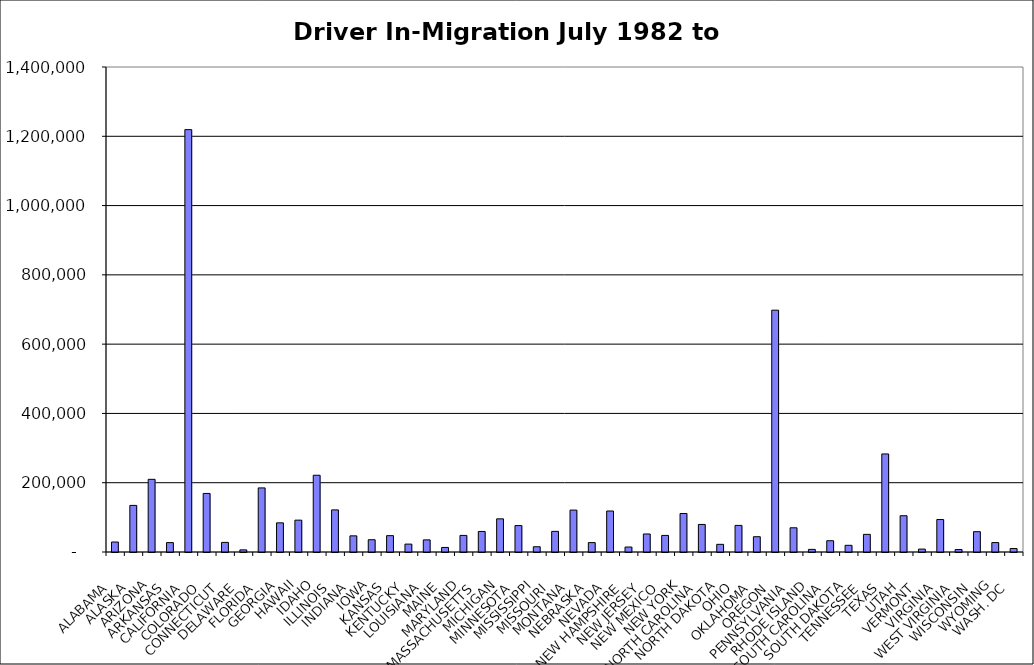
| Category | Series 0 |
|---|---|
|  ALABAMA  | 28818.5 |
|  ALASKA  | 134505.5 |
|  ARIZONA  | 209773 |
|  ARKANSAS  | 27127.5 |
|  CALIFORNIA  | 1219220.5 |
|  COLORADO  | 169067 |
|  CONNECTICUT  | 27771 |
|  DELAWARE  | 6169.5 |
|  FLORIDA  | 185001 |
|  GEORGIA  | 84205 |
|  HAWAII  | 91956.5 |
|  IDAHO  | 221551.5 |
|  ILLINOIS  | 121548.5 |
|  INDIANA  | 46621 |
|  IOWA  | 35422.5 |
|  KANSAS  | 47178.5 |
|  KENTUCKY  | 22809 |
|  LOUISIANA  | 34989.5 |
|  MAINE  | 13169.5 |
|  MARYLAND  | 47856 |
|  MASSACHUSETTS  | 59275 |
|  MICHIGAN  | 95718 |
|  MINNESOTA  | 76249.5 |
|  MISSISSIPPI  | 15194 |
|  MISSOURI  | 59562 |
|  MONTANA  | 120986 |
|  NEBRASKA  | 27114.5 |
|  NEVADA  | 118331 |
|  NEW HAMPSHIRE  | 14348.5 |
|  NEW JERSEY  | 52033 |
|  NEW MEXICO  | 47895 |
|  NEW YORK  | 111098 |
|  NORTH CAROLINA  | 79548.5 |
|  NORTH DAKOTA  | 22144.5 |
|  OHIO  | 76802.5 |
|  OKLAHOMA  | 44139 |
|  OREGON  | 698045 |
|  PENNSYLVANIA  | 69889.5 |
|  RHODE ISLAND  | 7553 |
|  SOUTH CAROLINA  | 32556.5 |
|  SOUTH DAKOTA  | 19294.5 |
|  TENNESSEE  | 50884.5 |
|  TEXAS  | 283063 |
|  UTAH  | 104704.5 |
|  VERMONT  | 8431 |
|  VIRGINIA  | 93691 |
|  WEST VIRGINIA  | 7111.5 |
|  WISCONSIN  | 58663.5 |
|  WYOMING  | 27209 |
|  WASH. DC  | 10042 |